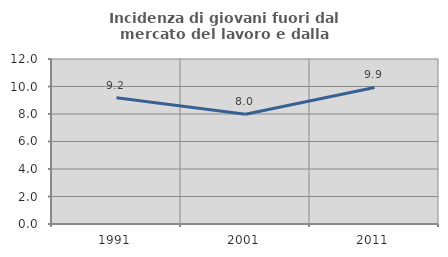
| Category | Incidenza di giovani fuori dal mercato del lavoro e dalla formazione  |
|---|---|
| 1991.0 | 9.189 |
| 2001.0 | 7.977 |
| 2011.0 | 9.93 |